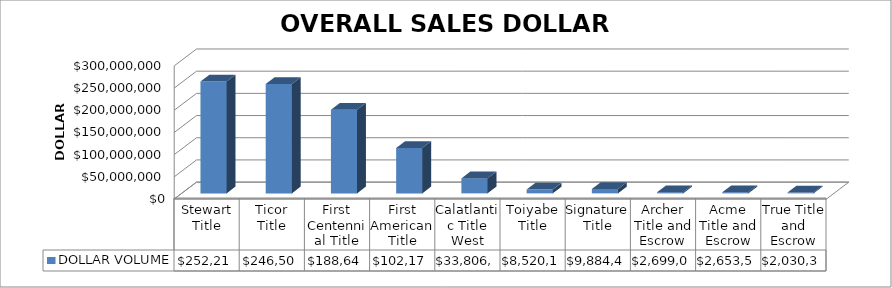
| Category | DOLLAR VOLUME |
|---|---|
| Stewart Title | 252210297.83 |
| Ticor Title | 246505292 |
| First Centennial Title | 188642758 |
| First American Title | 102177012.89 |
| Calatlantic Title West | 33806810 |
| Toiyabe Title | 8520150 |
| Signature Title | 9884400 |
| Archer Title and Escrow | 2699000 |
| Acme Title and Escrow | 2653500 |
| True Title and Escrow | 2030380 |